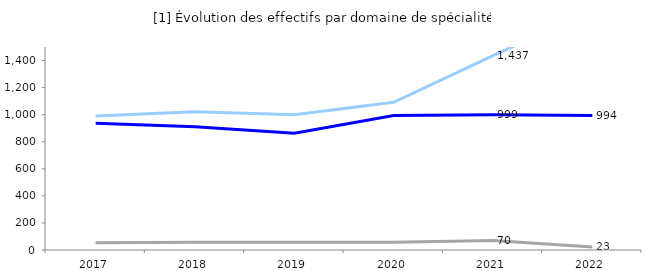
| Category | Domaines de la production | Domaines des services | Domaines disciplinaires |
|---|---|---|---|
| 2017 | 937 | 991 | 53 |
| 2018 | 910 | 1021 | 57 |
| 2019 | 862 | 1000 | 58 |
| 2020 | 993 | 1091 | 58 |
| 2021 | 999 | 1437 | 70 |
| 2022 | 994 | 1764 | 23 |